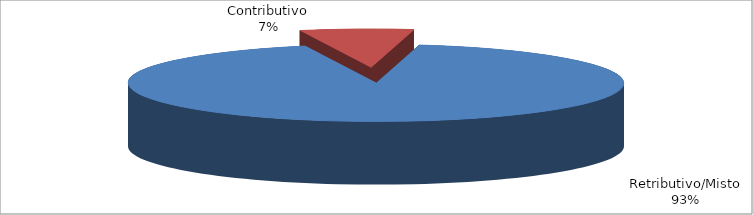
| Category | Decorrenti gennaio - settembre 2020 |
|---|---|
| Retributivo/Misto | 235491 |
| Contributivo | 18835 |